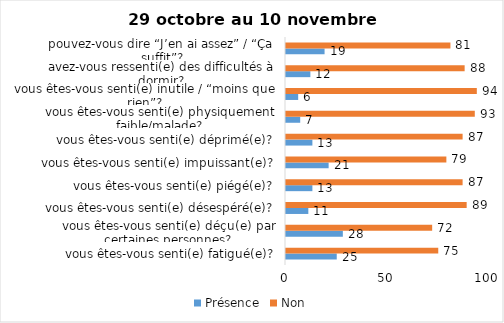
| Category | Présence | Non |
|---|---|---|
| vous êtes-vous senti(e) fatigué(e)? | 25 | 75 |
| vous êtes-vous senti(e) déçu(e) par certaines personnes? | 28 | 72 |
| vous êtes-vous senti(e) désespéré(e)? | 11 | 89 |
| vous êtes-vous senti(e) piégé(e)? | 13 | 87 |
| vous êtes-vous senti(e) impuissant(e)? | 21 | 79 |
| vous êtes-vous senti(e) déprimé(e)? | 13 | 87 |
| vous êtes-vous senti(e) physiquement faible/malade? | 7 | 93 |
| vous êtes-vous senti(e) inutile / “moins que rien”? | 6 | 94 |
| avez-vous ressenti(e) des difficultés à dormir? | 12 | 88 |
| pouvez-vous dire “J’en ai assez” / “Ça suffit”? | 19 | 81 |